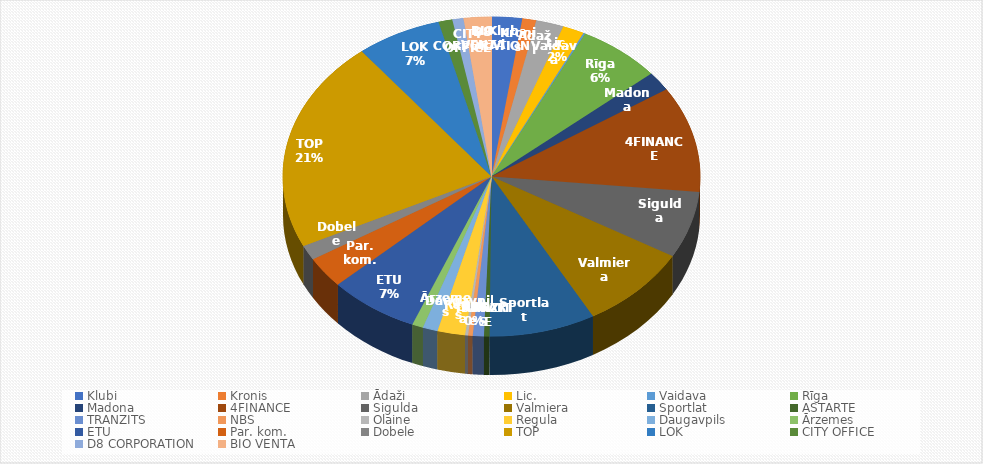
| Category | Series 0 |
|---|---|
| Klubi | 1100 |
| Kronis | 500 |
| Ādaži | 1000 |
| Lic. | 780 |
| Vaidava | 61.2 |
| Rīga | 3015 |
| Madona | 900 |
| 4FINANCE | 5000 |
| Sigulda | 3144 |
| Valmiera | 4018 |
| Sportlat | 3828.5 |
| ASTARTE | 200 |
| TRANZITS | 400 |
| NBS | 165 |
| Olaine | 108 |
| Regula | 1000 |
| Daugavpils | 541 |
| Ārzemes | 400 |
| ETU | 3250 |
| Par. kom. | 1476 |
| Dobele | 700 |
| TOP | 10000 |
| LOK | 3069.87 |
| CITY OFFICE | 500 |
| D8 CORPORATION | 400 |
| BIO VENTA | 1000 |